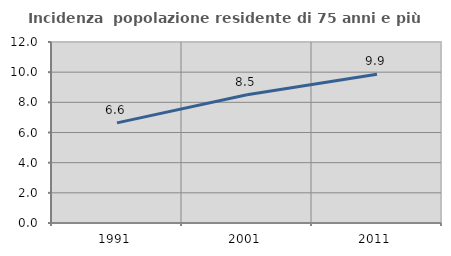
| Category | Incidenza  popolazione residente di 75 anni e più |
|---|---|
| 1991.0 | 6.639 |
| 2001.0 | 8.502 |
| 2011.0 | 9.859 |